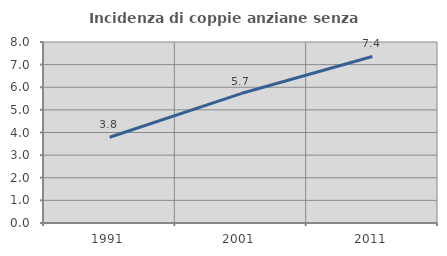
| Category | Incidenza di coppie anziane senza figli  |
|---|---|
| 1991.0 | 3.79 |
| 2001.0 | 5.721 |
| 2011.0 | 7.361 |